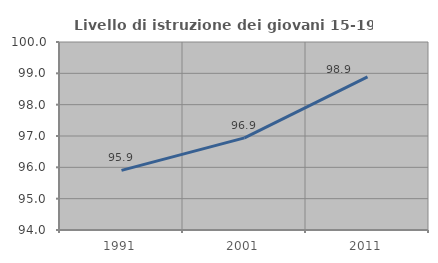
| Category | Livello di istruzione dei giovani 15-19 anni |
|---|---|
| 1991.0 | 95.904 |
| 2001.0 | 96.939 |
| 2011.0 | 98.889 |